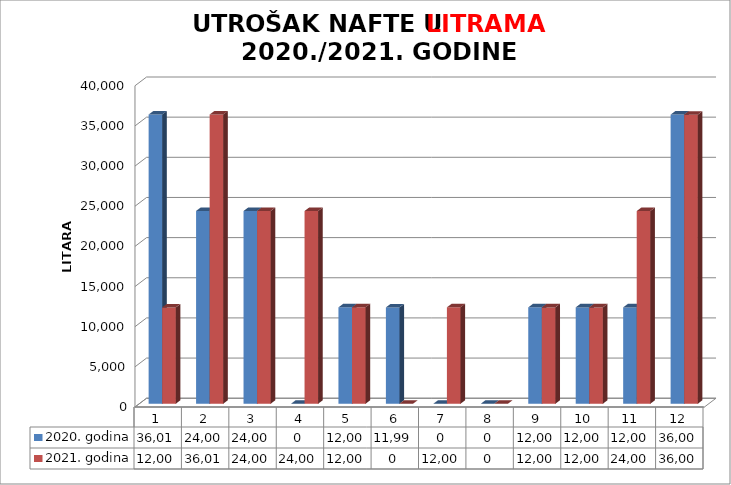
| Category | 2020. godina | 2021. godina |
|---|---|---|
| 0 | 36013 | 12000 |
| 1 | 24006 | 36012 |
| 2 | 24005 | 24007 |
| 3 | 0 | 24005 |
| 4 | 12002 | 12002 |
| 5 | 11999 | 0 |
| 6 | 0 | 12004 |
| 7 | 0 | 0 |
| 8 | 12002 | 12001 |
| 9 | 12001 | 12001 |
| 10 | 12001 | 24000 |
| 11 | 36006 | 36000 |